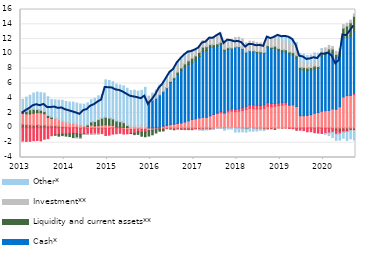
| Category | Transaction accounts | Housing | Consumer | Cash* | Liquidity and current assets** | Investment** | Other* |
|---|---|---|---|---|---|---|---|
| 2013-01-01 | 0.508 | 1.431 | -1.847 | 0 | 0.247 | -0.025 | 1.661 |
| 2013-02-01 | 0.453 | 1.445 | -1.828 | 0 | 0.347 | 0.059 | 1.858 |
| 2013-03-01 | 0.396 | 1.481 | -1.809 | 0 | 0.577 | 0.174 | 1.791 |
| 2013-04-01 | 0.363 | 1.611 | -1.729 | 0 | 0.524 | 0.158 | 2.057 |
| 2013-05-01 | 0.428 | 1.629 | -1.697 | 0 | 0.421 | 0.119 | 2.236 |
| 2013-06-01 | 0.354 | 1.679 | -1.76 | 0 | 0.356 | 0.073 | 2.298 |
| 2013-07-01 | 0.377 | 1.547 | -1.534 | 0 | 0.28 | 0.055 | 2.445 |
| 2013-08-01 | 0.277 | 1.122 | -1.451 | 0 | 0.273 | 0.107 | 2.436 |
| 2013-09-01 | 0.283 | 0.981 | -1.058 | 0 | 0.173 | 0.116 | 2.267 |
| 2013-10-01 | 0.296 | 0.993 | -0.949 | 0 | -0.033 | 0.081 | 2.425 |
| 2013-11-01 | 0.234 | 0.883 | -0.898 | 0 | -0.218 | 0.069 | 2.571 |
| 2013-12-01 | 0.178 | 0.692 | -0.843 | 0 | -0.202 | 0.115 | 2.751 |
| 2014-01-01 | 0.161 | 0.59 | -0.827 | 0 | -0.283 | 0.112 | 2.704 |
| 2014-02-01 | 0.047 | 0.58 | -0.791 | 0 | -0.379 | 0.1 | 2.763 |
| 2014-03-01 | 0.093 | 0.545 | -0.742 | 0 | -0.569 | 0.016 | 2.827 |
| 2014-04-01 | 0.086 | 0.425 | -0.769 | 0 | -0.554 | -0.011 | 2.841 |
| 2014-05-01 | -0.103 | 0.39 | -0.777 | 0 | -0.503 | -0.016 | 2.846 |
| 2014-06-01 | 0.02 | 0.27 | -0.77 | 0 | -0.102 | -0.004 | 2.917 |
| 2014-07-01 | -0.1 | 0.167 | -0.769 | 0 | 0.237 | -0.031 | 2.979 |
| 2014-08-01 | -0.098 | 0.395 | -0.748 | 0 | 0.414 | -0.032 | 3.01 |
| 2014-09-01 | -0.081 | 0.267 | -0.729 | 0 | 0.594 | -0.055 | 3.145 |
| 2014-10-01 | -0.149 | 0.302 | -0.669 | 0 | 0.817 | -0.022 | 3.213 |
| 2014-11-01 | -0.14 | 0.382 | -0.636 | 0 | 0.945 | 0.036 | 3.176 |
| 2014-12-01 | -0.096 | 0.404 | -0.93 | 0 | 1.047 | 0.02 | 5.023 |
| 2015-01-01 | -0.103 | 0.371 | -0.88 | 0 | 0.971 | 0.029 | 5.041 |
| 2015-02-01 | 0.049 | 0.294 | -0.837 | 0 | 0.885 | 0.01 | 4.996 |
| 2015-03-01 | 0.079 | 0.039 | -0.79 | 0 | 0.818 | 0.043 | 4.945 |
| 2015-04-01 | 0.097 | -0.029 | -0.7 | 0 | 0.733 | 0.112 | 4.846 |
| 2015-05-01 | 0.037 | -0.211 | -0.623 | 0 | 0.663 | 0.156 | 4.828 |
| 2015-06-01 | 0.048 | -0.237 | -0.564 | 0 | 0.273 | 0.217 | 4.827 |
| 2015-07-01 | 0.011 | -0.222 | -0.512 | 0 | -0.03 | 0.258 | 4.777 |
| 2015-08-01 | 0.06 | -0.235 | -0.472 | 0 | -0.202 | 0.254 | 4.784 |
| 2015-09-01 | -0.027 | -0.077 | -0.415 | 0 | -0.356 | 0.321 | 4.643 |
| 2015-10-01 | -0.034 | -0.17 | -0.385 | 0 | -0.533 | 0.409 | 4.662 |
| 2015-11-01 | 0.008 | -0.216 | -0.356 | 0 | -0.624 | 0.491 | 4.982 |
| 2015-12-01 | -0.089 | -0.265 | -0.024 | 3.632 | -0.722 | 0.632 | 0.016 |
| 2016-01-01 | -0.127 | -0.175 | -0.021 | 3.762 | -0.611 | 0.682 | 0.257 |
| 2016-02-01 | -0.043 | -0.189 | 0.001 | 4.013 | -0.457 | 0.748 | 0.372 |
| 2016-03-01 | -0.152 | 0.065 | 0.042 | 4.376 | -0.299 | 0.899 | 0.433 |
| 2016-04-01 | -0.291 | 0.194 | 0.05 | 4.714 | -0.12 | 0.918 | 0.433 |
| 2016-05-01 | -0.108 | 0.303 | 0.059 | 5.046 | 0.031 | 0.954 | 0.425 |
| 2016-06-01 | -0.176 | 0.432 | 0.056 | 5.656 | 0.139 | 0.962 | 0.437 |
| 2016-07-01 | -0.255 | 0.503 | 0.03 | 6.024 | 0.239 | 0.947 | 0.404 |
| 2016-08-01 | -0.154 | 0.606 | 0.004 | 6.623 | 0.307 | 0.957 | 0.426 |
| 2016-09-01 | -0.178 | 0.661 | -0.02 | 7.102 | 0.348 | 1.031 | 0.396 |
| 2016-10-01 | -0.176 | 0.793 | -0.055 | 7.461 | 0.394 | 1.006 | 0.414 |
| 2016-11-01 | -0.174 | 0.952 | -0.065 | 7.609 | 0.499 | 0.969 | 0.433 |
| 2016-12-01 | -0.201 | 1.131 | -0.045 | 7.685 | 0.596 | 0.886 | 0.263 |
| 2017-01-01 | -0.106 | 1.22 | -0.024 | 7.92 | 0.595 | 0.87 | 0.053 |
| 2017-02-01 | -0.207 | 1.343 | -0.03 | 8.279 | 0.584 | 0.861 | -0.029 |
| 2017-03-01 | -0.208 | 1.424 | -0.041 | 8.897 | 0.588 | 0.894 | -0.087 |
| 2017-04-01 | -0.152 | 1.419 | -0.038 | 9.037 | 0.509 | 0.925 | -0.101 |
| 2017-05-01 | -0.139 | 1.617 | -0.009 | 9.239 | 0.4 | 0.979 | 0.036 |
| 2017-06-01 | -0.149 | 1.807 | 0.026 | 9.09 | 0.33 | 1.082 | -0.071 |
| 2017-07-01 | -0.013 | 1.938 | 0.095 | 9.039 | 0.286 | 1.153 | -0.047 |
| 2017-08-01 | -0.026 | 2.037 | 0.187 | 9.028 | 0.319 | 1.239 | -0.048 |
| 2017-09-01 | -0.096 | 1.953 | 0.144 | 8.311 | 0.208 | 1.123 | -0.228 |
| 2017-10-01 | -0.014 | 2.157 | 0.238 | 8.209 | 0.241 | 1.163 | -0.142 |
| 2017-11-01 | -0.023 | 2.254 | 0.303 | 8.195 | 0.045 | 1.16 | -0.142 |
| 2017-12-01 | -0.056 | 2.205 | 0.311 | 8.33 | 0.09 | 1.26 | -0.508 |
| 2018-01-01 | -0.081 | 2.265 | 0.327 | 8.3 | 0.083 | 1.278 | -0.481 |
| 2018-02-01 | -0.113 | 2.34 | 0.369 | 7.965 | 0.047 | 1.301 | -0.424 |
| 2018-03-01 | -0.111 | 2.495 | 0.416 | 7.335 | -0.033 | 1.25 | -0.433 |
| 2018-04-01 | -0.081 | 2.649 | 0.463 | 7.33 | -0.002 | 1.282 | -0.359 |
| 2018-05-01 | -0.115 | 2.601 | 0.491 | 7.248 | 0.078 | 1.279 | -0.329 |
| 2018-06-01 | -0.166 | 2.547 | 0.505 | 7.138 | 0.143 | 1.197 | -0.261 |
| 2018-07-01 | -0.145 | 2.554 | 0.495 | 7.101 | 0.124 | 1.2 | -0.178 |
| 2018-08-01 | -0.225 | 2.647 | 0.474 | 6.992 | 0.092 | 1.178 | -0.137 |
| 2018-09-01 | -0.14 | 2.915 | 0.498 | 7.489 | 0.205 | 1.226 | 0.07 |
| 2018-10-01 | -0.125 | 2.846 | 0.442 | 7.456 | 0.158 | 1.193 | 0.104 |
| 2018-11-01 | -0.206 | 2.929 | 0.385 | 7.416 | 0.306 | 1.244 | 0.165 |
| 2018-12-01 | -0.005 | 3.009 | 0.366 | 7.096 | 0.257 | 1.224 | 0.559 |
| 2019-01-01 | -0.045 | 3.078 | 0.343 | 6.898 | 0.267 | 1.186 | 0.594 |
| 2019-02-01 | -0.024 | 3.175 | 0.284 | 6.823 | 0.273 | 1.178 | 0.658 |
| 2019-03-01 | -0.041 | 3.067 | -0.017 | 6.909 | 0.281 | 1.148 | 0.909 |
| 2019-04-01 | -0.041 | 3.102 | -0.071 | 6.728 | 0.35 | 0.959 | 0.944 |
| 2019-05-01 | -0.101 | 2.892 | -0.229 | 6.532 | 0.332 | 0.851 | 0.917 |
| 2019-06-01 | -0.032 | 1.641 | -0.277 | 6.225 | 0.324 | 0.815 | 0.995 |
| 2019-07-01 | -0.025 | 1.64 | -0.34 | 6.167 | 0.367 | 0.718 | 1.061 |
| 2019-08-01 | -0.025 | 1.693 | -0.499 | 6.043 | 0.38 | 0.64 | 1.02 |
| 2019-09-01 | 0.002 | 1.775 | -0.51 | 6.049 | 0.332 | 0.612 | 1.07 |
| 2019-10-01 | -0.05 | 1.982 | -0.601 | 6.001 | 0.376 | 0.64 | 1.136 |
| 2019-11-01 | 0.007 | 2.063 | -0.707 | 6.01 | 0.22 | 0.687 | 1.091 |
| 2019-12-01 | -0.045 | 2.247 | -0.705 | 7.459 | 0.31 | 0.604 | 0.11 |
| 2020-01-31 | -0.067 | 2.32 | -0.682 | 7.598 | 0.358 | 0.543 | -0.106 |
| 2020-02-29 | -0.05 | 2.357 | -0.646 | 7.878 | 0.431 | 0.481 | -0.343 |
| 2020-03-31 | -0.142 | 2.559 | -0.469 | 7.592 | 0.497 | 0.362 | -0.692 |
| 2020-04-30 | -0.391 | 2.519 | -0.482 | 6.976 | 0.428 | 0.428 | -0.806 |
| 2020-05-31 | -0.497 | 2.845 | -0.315 | 6.823 | 0.636 | 0.451 | -0.835 |
| 2020-06-30 | -0.368 | 4.188 | -0.212 | 7.993 | 1.298 | 0.472 | -0.813 |
| 2020-07-31 | -0.412 | 4.363 | -0.136 | 7.827 | 1.569 | 0.389 | -1.143 |
| 2020-08-31 | -0.35 | 4.374 | 0.053 | 7.995 | 1.779 | 0.365 | -1.138 |
| 2020-09-30 | -0.363 | 4.491 | 0.175 | 8.283 | 2.132 | 0.326 | -1.274 |